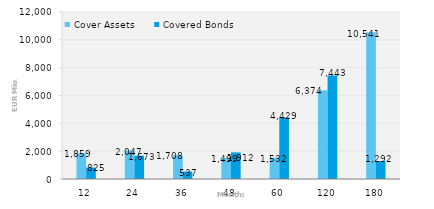
| Category | Cover Assets | Covered Bonds |
|---|---|---|
| 12.0 | 1859.305 | 825 |
| 24.0 | 2047.079 | 1672.5 |
| 36.0 | 1708.288 | 537 |
| 48.0 | 1499.241 | 1912.426 |
| 60.0 | 1532.093 | 4428.5 |
| 120.0 | 6373.603 | 7442.615 |
| 180.0 | 10541.284 | 1292 |